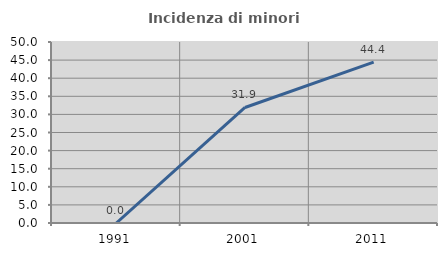
| Category | Incidenza di minori stranieri |
|---|---|
| 1991.0 | 0 |
| 2001.0 | 31.915 |
| 2011.0 | 44.444 |